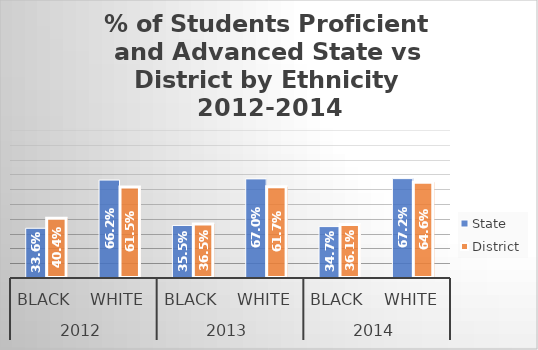
| Category | State | District |
|---|---|---|
| 0 | 0.336 | 0.404 |
| 1 | 0.662 | 0.615 |
| 2 | 0.355 | 0.365 |
| 3 | 0.67 | 0.617 |
| 4 | 0.347 | 0.361 |
| 5 | 0.672 | 0.646 |